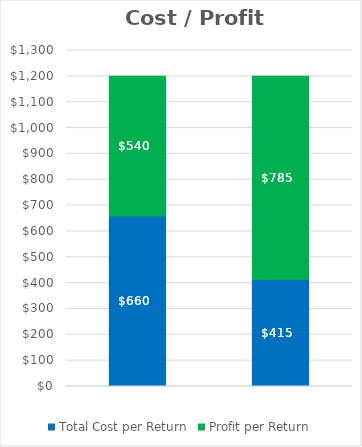
| Category | Total Cost per Return | Profit per Return |
|---|---|---|
| 0 | 660 | 540 |
| 1 | 415.2 | 784.8 |